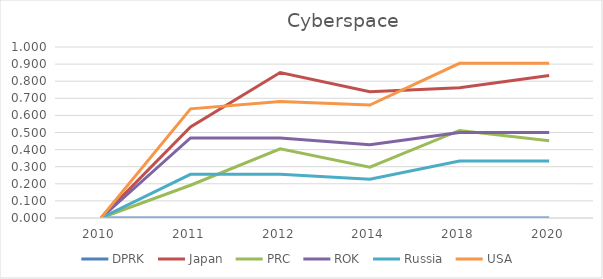
| Category | DPRK  | Japan  | PRC  | ROK  | Russia  | USA  |
|---|---|---|---|---|---|---|
| 2010.0 | 0 | 0 | 0 | 0 | 0 | 0 |
| 2011.0 | 0 | 0.532 | 0.191 | 0.468 | 0.255 | 0.638 |
| 2012.0 | 0 | 0.851 | 0.404 | 0.468 | 0.255 | 0.681 |
| 2014.0 | 0 | 0.738 | 0.298 | 0.429 | 0.226 | 0.661 |
| 2018.0 | 0 | 0.762 | 0.512 | 0.5 | 0.333 | 0.905 |
| 2020.0 | 0 | 0.833 | 0.452 | 0.5 | 0.333 | 0.905 |